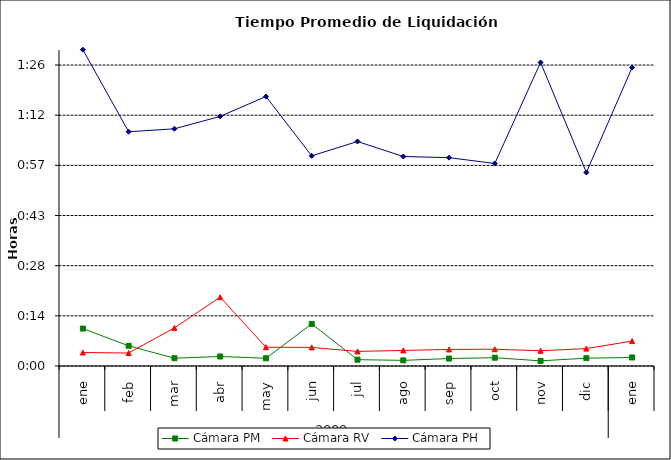
| Category | Cámara PM | Cámara RV | Cámara PH |
|---|---|---|---|
| 0 | 0.007 | 0.003 | 0.063 |
| 1 | 0.004 | 0.003 | 0.047 |
| 2 | 0.002 | 0.008 | 0.047 |
| 3 | 0.002 | 0.014 | 0.05 |
| 4 | 0.002 | 0.004 | 0.054 |
| 5 | 0.008 | 0.004 | 0.042 |
| 6 | 0.001 | 0.003 | 0.045 |
| 7 | 0.001 | 0.003 | 0.042 |
| 8 | 0.001 | 0.003 | 0.042 |
| 9 | 0.002 | 0.003 | 0.04 |
| 10 | 0.001 | 0.003 | 0.061 |
| 11 | 0.002 | 0.003 | 0.039 |
| 12 | 0.002 | 0.005 | 0.06 |